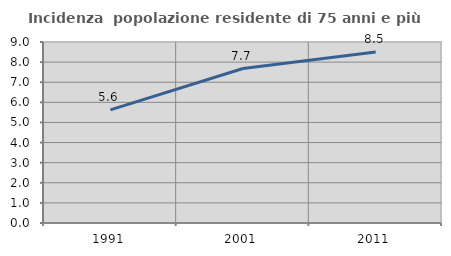
| Category | Incidenza  popolazione residente di 75 anni e più |
|---|---|
| 1991.0 | 5.628 |
| 2001.0 | 7.682 |
| 2011.0 | 8.505 |